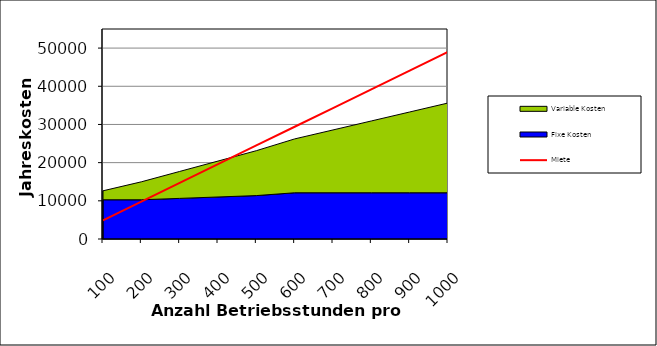
| Category | Miete |
|---|---|
| 0 | 4900 |
| 1 | 9800 |
| 2 | 14700 |
| 3 | 19600 |
| 4 | 24500 |
| 5 | 29400 |
| 6 | 34300 |
| 7 | 39200 |
| 8 | 44100 |
| 9 | 49000 |